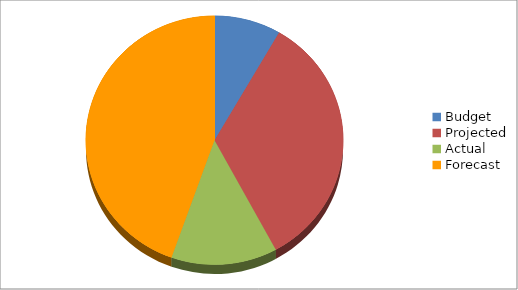
| Category | Series 0 |
|---|---|
| Budget | 540 |
| Projected | 2180 |
| Actual | 860 |
| Forecast | 2880 |